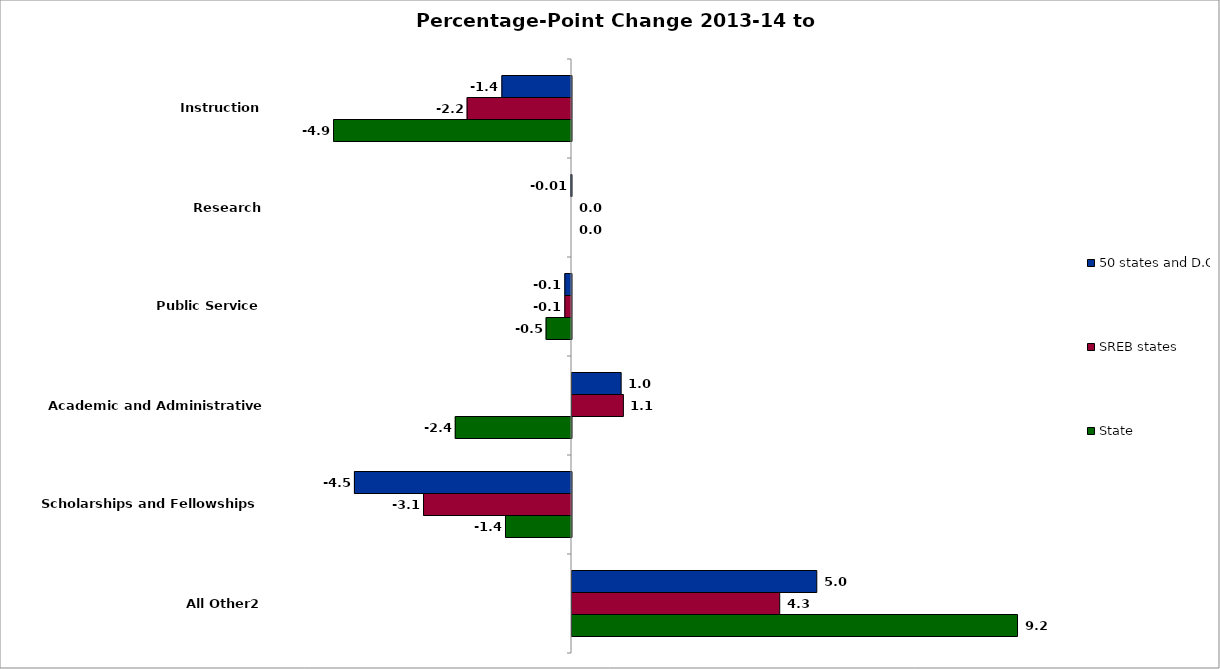
| Category | 50 states and D.C. | SREB states | State |
|---|---|---|---|
| Instruction | -1.435 | -2.152 | -4.906 |
| Research | -0.013 | 0 | 0 |
| Public Service | -0.137 | -0.137 | -0.523 |
| Academic and Administrative Support3 | 1.014 | 1.06 | -2.396 |
| Scholarships and Fellowships | -4.476 | -3.051 | -1.361 |
| All Other2 | 5.047 | 4.283 | 9.186 |